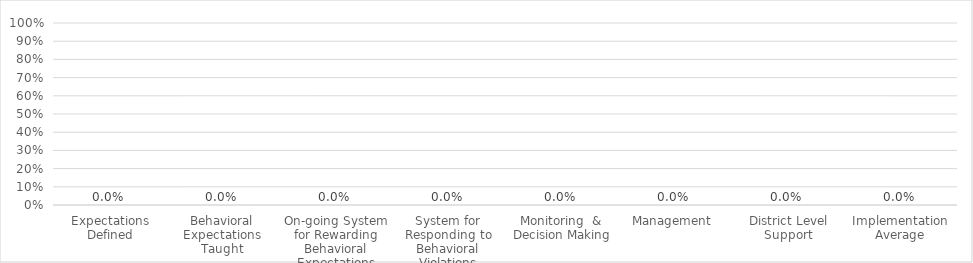
| Category | Series 0 |
|---|---|
| Expectations Defined | 0 |
| Behavioral Expectations Taught | 0 |
| On-going System for Rewarding Behavioral Expectations | 0 |
| System for Responding to Behavioral Violations | 0 |
| Monitoring  &  Decision Making | 0 |
| Management | 0 |
| District Level Support | 0 |
| Implementation Average | 0 |